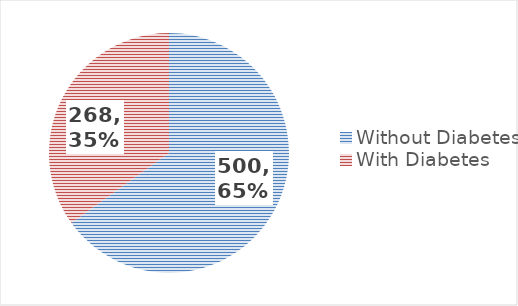
| Category | Frequency |
|---|---|
| Without Diabetes | 500 |
| With Diabetes | 268 |